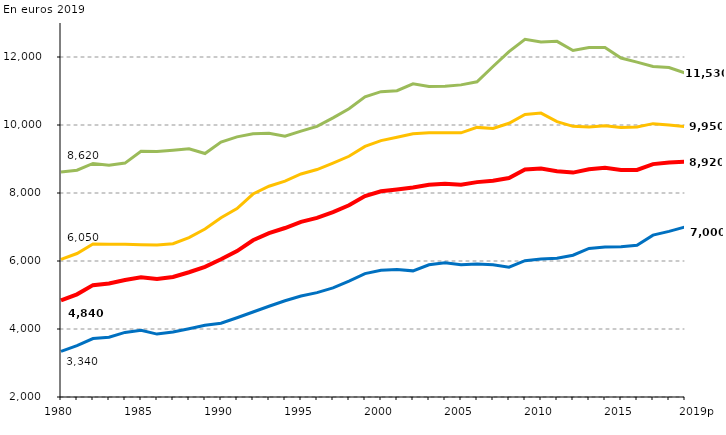
| Category | Dépense moyenne par élève | Dépense moyenne pour un élève du 1er degré | Dépense moyenne pour un élève du 2nd degré | Dépense moyenne pour un élève du supérieur |
|---|---|---|---|---|
| 1980 | 4840 | 3340 | 6050 | 8620 |
| 1981 | 5020 | 3510 | 6220 | 8670 |
| 1982 | 5290 | 3720 | 6500 | 8870 |
| 1983 | 5340 | 3760 | 6490 | 8820 |
| 1984 | 5440 | 3900 | 6490 | 8880 |
| 1985 | 5520 | 3960 | 6480 | 9230 |
| 1986 | 5470 | 3850 | 6470 | 9220 |
| 1987 | 5530 | 3910 | 6510 | 9260 |
| 1988 | 5670 | 4010 | 6690 | 9300 |
| 1989 | 5830 | 4110 | 6940 | 9160 |
| 1990 | 6050 | 4170 | 7270 | 9500 |
| 1991 | 6290 | 4330 | 7540 | 9650 |
| 1992 | 6610 | 4500 | 7970 | 9740 |
| 1993 | 6820 | 4670 | 8200 | 9760 |
| 1994 | 6970 | 4830 | 8350 | 9670 |
| 1995 | 7150 | 4970 | 8560 | 9820 |
| 1996 | 7270 | 5070 | 8690 | 9960 |
| 1997 | 7440 | 5210 | 8880 | 10210 |
| 1998 | 7640 | 5410 | 9080 | 10480 |
| 1999 | 7910 | 5630 | 9370 | 10830 |
| 2000 | 8050 | 5730 | 9540 | 10980 |
| 2001 | 8100 | 5750 | 9640 | 11010 |
| 2002 | 8160 | 5710 | 9740 | 11210 |
| 2003 | 8240 | 5890 | 9770 | 11130 |
| 2004 | 8270 | 5950 | 9770 | 11140 |
| 2005 | 8240 | 5890 | 9770 | 11180 |
| 2006 | 8320 | 5910 | 9930 | 11270 |
| 2007 | 8360 | 5890 | 9900 | 11720 |
| 2008 | 8440 | 5820 | 10050 | 12160 |
| 2009 | 8690 | 6010 | 10310 | 12520 |
| 2010 | 8720 | 6060 | 10350 | 12440 |
| 2011 | 8640 | 6080 | 10100 | 12460 |
| 2012 | 8600 | 6170 | 9960 | 12190 |
| 2013 | 8700 | 6370 | 9940 | 12280 |
| 2014 | 8740 | 6410 | 9980 | 12280 |
| 2015 | 8680 | 6420 | 9930 | 11970 |
| 2016 | 8680 | 6460 | 9940 | 11850 |
| 2017 | 8850 | 6760 | 10040 | 11720 |
| 2018 | 8900 | 6870 | 10000 | 11690 |
| 2019p | 8920 | 7000 | 9950 | 11530 |